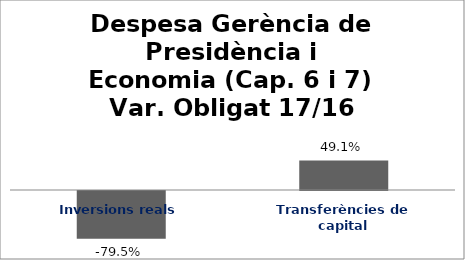
| Category | Series 0 |
|---|---|
| Inversions reals | -0.795 |
| Transferències de capital | 0.491 |